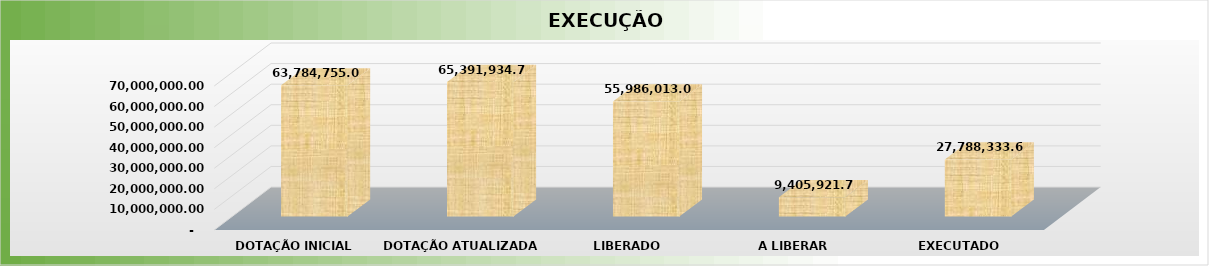
| Category | Series 0 |
|---|---|
| 0 | 63784755 |
| 1 | 65391934.77 |
| 2 | 55986013.07 |
| 3 | 9405921.7 |
| 4 | 27788333.64 |